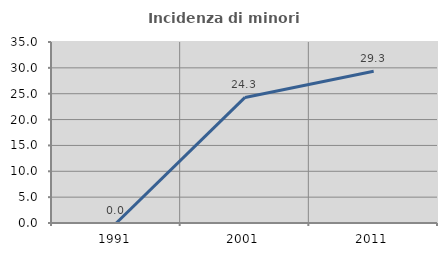
| Category | Incidenza di minori stranieri |
|---|---|
| 1991.0 | 0 |
| 2001.0 | 24.286 |
| 2011.0 | 29.333 |